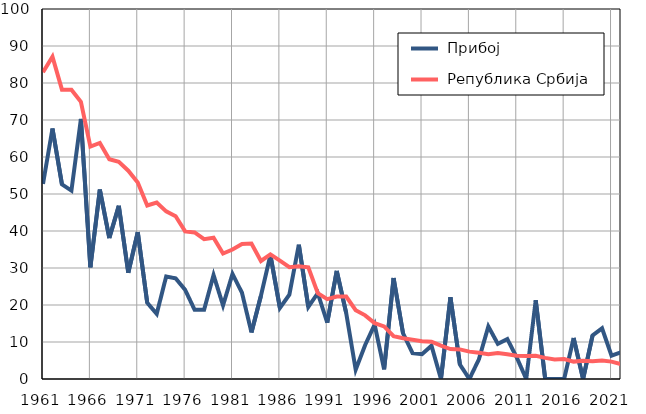
| Category |  Прибој |  Република Србија |
|---|---|---|
| 1961.0 | 52.7 | 82.9 |
| 1962.0 | 67.7 | 87.1 |
| 1963.0 | 52.6 | 78.2 |
| 1964.0 | 50.9 | 78.2 |
| 1965.0 | 70.3 | 74.9 |
| 1966.0 | 30.2 | 62.8 |
| 1967.0 | 51.2 | 63.8 |
| 1968.0 | 38.1 | 59.4 |
| 1969.0 | 46.8 | 58.7 |
| 1970.0 | 28.7 | 56.3 |
| 1971.0 | 39.7 | 53.1 |
| 1972.0 | 20.6 | 46.9 |
| 1973.0 | 17.6 | 47.7 |
| 1974.0 | 27.7 | 45.3 |
| 1975.0 | 27.2 | 44 |
| 1976.0 | 24.1 | 39.9 |
| 1977.0 | 18.7 | 39.6 |
| 1978.0 | 18.7 | 37.8 |
| 1979.0 | 28.1 | 38.2 |
| 1980.0 | 19.9 | 33.9 |
| 1981.0 | 28.4 | 35 |
| 1982.0 | 23.3 | 36.5 |
| 1983.0 | 12.6 | 36.6 |
| 1984.0 | 22.5 | 31.9 |
| 1985.0 | 33.5 | 33.7 |
| 1986.0 | 19.2 | 32 |
| 1987.0 | 22.8 | 30.2 |
| 1988.0 | 36.3 | 30.5 |
| 1989.0 | 19.5 | 30.2 |
| 1990.0 | 23.2 | 23.2 |
| 1991.0 | 15.2 | 21.6 |
| 1992.0 | 29.2 | 22.3 |
| 1993.0 | 17.8 | 22.3 |
| 1994.0 | 2.5 | 18.6 |
| 1995.0 | 9.2 | 17.2 |
| 1996.0 | 14.7 | 15.1 |
| 1997.0 | 2.6 | 14.2 |
| 1998.0 | 27.3 | 11.6 |
| 1999.0 | 12.3 | 11 |
| 2000.0 | 7 | 10.6 |
| 2001.0 | 6.7 | 10.2 |
| 2002.0 | 9 | 10.1 |
| 2003.0 | 0 | 9 |
| 2004.0 | 22.1 | 8.1 |
| 2005.0 | 3.9 | 8 |
| 2006.0 | 0 | 7.4 |
| 2007.0 | 5.3 | 7.1 |
| 2008.0 | 14.2 | 6.7 |
| 2009.0 | 9.5 | 7 |
| 2010.0 | 10.8 | 6.7 |
| 2011.0 | 5.8 | 6.3 |
| 2012.0 | 0 | 6.2 |
| 2013.0 | 21.3 | 6.3 |
| 2014.0 | 0 | 5.7 |
| 2015.0 | 0 | 5.3 |
| 2016.0 | 0 | 5.4 |
| 2017.0 | 11.1 | 4.7 |
| 2018.0 | 0 | 4.9 |
| 2019.0 | 11.8 | 4.8 |
| 2020.0 | 13.7 | 5 |
| 2021.0 | 6.3 | 4.7 |
| 2022.0 | 7.2 | 4 |